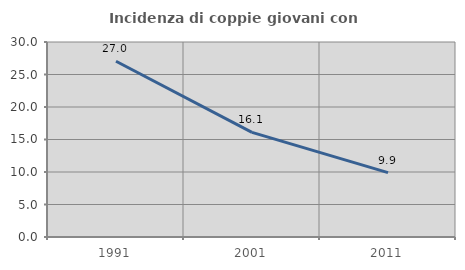
| Category | Incidenza di coppie giovani con figli |
|---|---|
| 1991.0 | 27.034 |
| 2001.0 | 16.105 |
| 2011.0 | 9.896 |